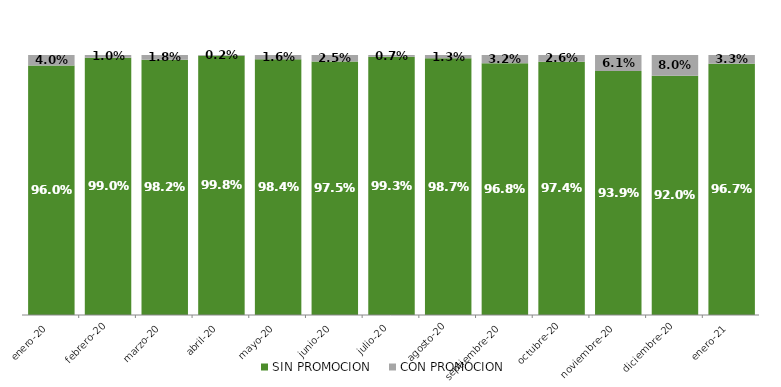
| Category | SIN PROMOCION   | CON PROMOCION   |
|---|---|---|
| 2020-01-01 | 0.96 | 0.04 |
| 2020-02-01 | 0.99 | 0.01 |
| 2020-03-01 | 0.982 | 0.018 |
| 2020-04-01 | 0.998 | 0.002 |
| 2020-05-01 | 0.984 | 0.016 |
| 2020-06-01 | 0.975 | 0.025 |
| 2020-07-01 | 0.993 | 0.007 |
| 2020-08-01 | 0.987 | 0.013 |
| 2020-09-01 | 0.968 | 0.032 |
| 2020-10-01 | 0.974 | 0.026 |
| 2020-11-01 | 0.939 | 0.061 |
| 2020-12-01 | 0.92 | 0.08 |
| 2021-01-01 | 0.967 | 0.033 |